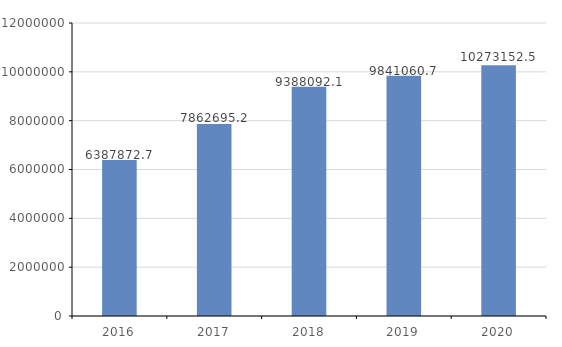
| Category | Series 0 |
|---|---|
| 2016.0 | 6387872.7 |
| 2017.0 | 7862695.2 |
| 2018.0 | 9388092.1 |
| 2019.0 | 9841060.7 |
| 2020.0 | 10273152.5 |